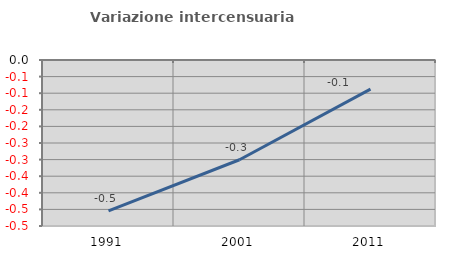
| Category | Variazione intercensuaria annua |
|---|---|
| 1991.0 | -0.455 |
| 2001.0 | -0.3 |
| 2011.0 | -0.088 |